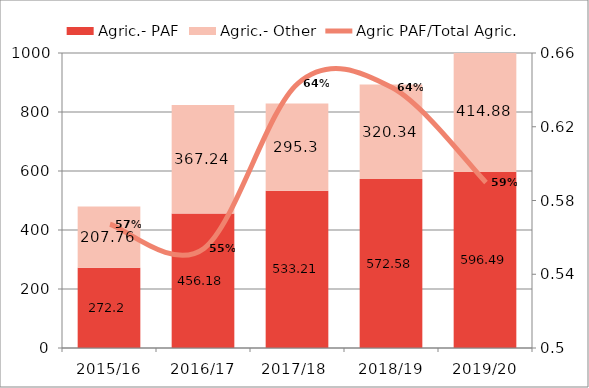
| Category | Agric.- PAF | Agric.- Other |
|---|---|---|
| 2015/16 | 272.2 | 207.76 |
| 2016/17 | 456.18 | 367.24 |
| 2017/18  | 533.21 | 295.3 |
| 2018/19 | 572.58 | 320.34 |
| 2019/20 | 596.49 | 414.88 |